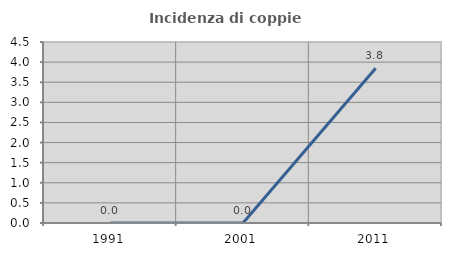
| Category | Incidenza di coppie miste |
|---|---|
| 1991.0 | 0 |
| 2001.0 | 0 |
| 2011.0 | 3.846 |